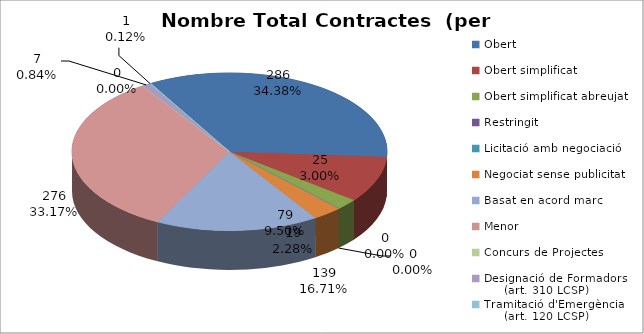
| Category | Nombre Total Contractes |
|---|---|
| Obert | 286 |
| Obert simplificat | 79 |
| Obert simplificat abreujat | 19 |
| Restringit | 0 |
| Licitació amb negociació | 0 |
| Negociat sense publicitat | 25 |
| Basat en acord marc | 139 |
| Menor | 276 |
| Concurs de Projectes | 0 |
| Designació de Formadors
     (art. 310 LCSP) | 7 |
| Tramitació d'Emergència
     (art. 120 LCSP) | 1 |